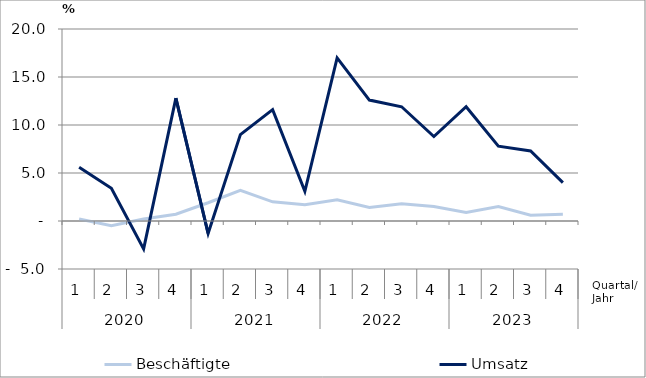
| Category | Beschäftigte | Umsatz |
|---|---|---|
| 0 | 0.2 | 5.6 |
| 1 | -0.5 | 3.4 |
| 2 | 0.2 | -2.9 |
| 3 | 0.7 | 12.8 |
| 4 | 1.9 | -1.3 |
| 5 | 3.2 | 9 |
| 6 | 2 | 11.6 |
| 7 | 1.7 | 3.1 |
| 8 | 2.2 | 17 |
| 9 | 1.4 | 12.6 |
| 10 | 1.8 | 11.9 |
| 11 | 1.5 | 8.8 |
| 12 | 0.9 | 11.9 |
| 13 | 1.5 | 7.8 |
| 14 | 0.6 | 7.3 |
| 15 | 0.7 | 4 |